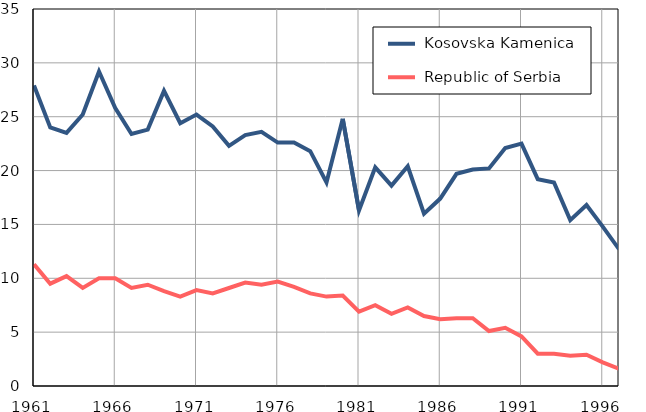
| Category |  Kosovska Kamenica |  Republic of Serbia |
|---|---|---|
| 1961.0 | 27.9 | 11.3 |
| 1962.0 | 24 | 9.5 |
| 1963.0 | 23.5 | 10.2 |
| 1964.0 | 25.2 | 9.1 |
| 1965.0 | 29.2 | 10 |
| 1966.0 | 25.8 | 10 |
| 1967.0 | 23.4 | 9.1 |
| 1968.0 | 23.8 | 9.4 |
| 1969.0 | 27.4 | 8.8 |
| 1970.0 | 24.4 | 8.3 |
| 1971.0 | 25.2 | 8.9 |
| 1972.0 | 24.1 | 8.6 |
| 1973.0 | 22.3 | 9.1 |
| 1974.0 | 23.3 | 9.6 |
| 1975.0 | 23.6 | 9.4 |
| 1976.0 | 22.6 | 9.7 |
| 1977.0 | 22.6 | 9.2 |
| 1978.0 | 21.8 | 8.6 |
| 1979.0 | 18.9 | 8.3 |
| 1980.0 | 24.8 | 8.4 |
| 1981.0 | 16.3 | 6.9 |
| 1982.0 | 20.3 | 7.5 |
| 1983.0 | 18.6 | 6.7 |
| 1984.0 | 20.4 | 7.3 |
| 1985.0 | 16 | 6.5 |
| 1986.0 | 17.4 | 6.2 |
| 1987.0 | 19.7 | 6.3 |
| 1988.0 | 20.1 | 6.3 |
| 1989.0 | 20.2 | 5.1 |
| 1990.0 | 22.1 | 5.4 |
| 1991.0 | 22.5 | 4.6 |
| 1992.0 | 19.2 | 3 |
| 1993.0 | 18.9 | 3 |
| 1994.0 | 15.4 | 2.8 |
| 1995.0 | 16.8 | 2.9 |
| 1996.0 | 14.8 | 2.2 |
| 1997.0 | 12.7 | 1.6 |